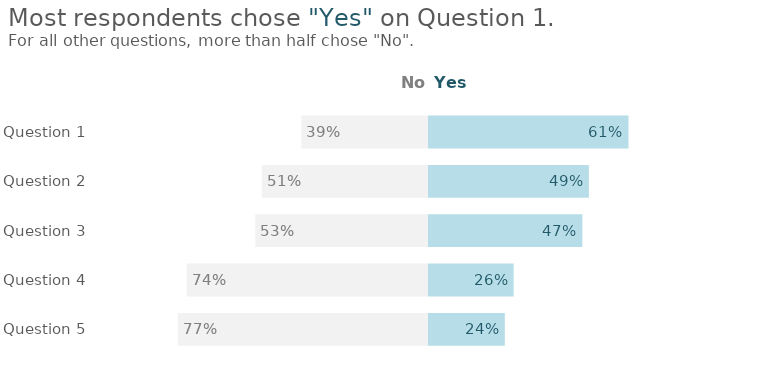
| Category | Buffer | No | Yes |
|---|---|---|---|
|  | 0 | 1 | 1 |
| Question 1 | 0.387 | 0.387 | 0.613 |
| Question 2 | 0.508 | 0.508 | 0.492 |
| Question 3 | 0.528 | 0.528 | 0.472 |
| Question 4 | 0.738 | 0.738 | 0.262 |
| Question 5 | 0.765 | 0.765 | 0.235 |